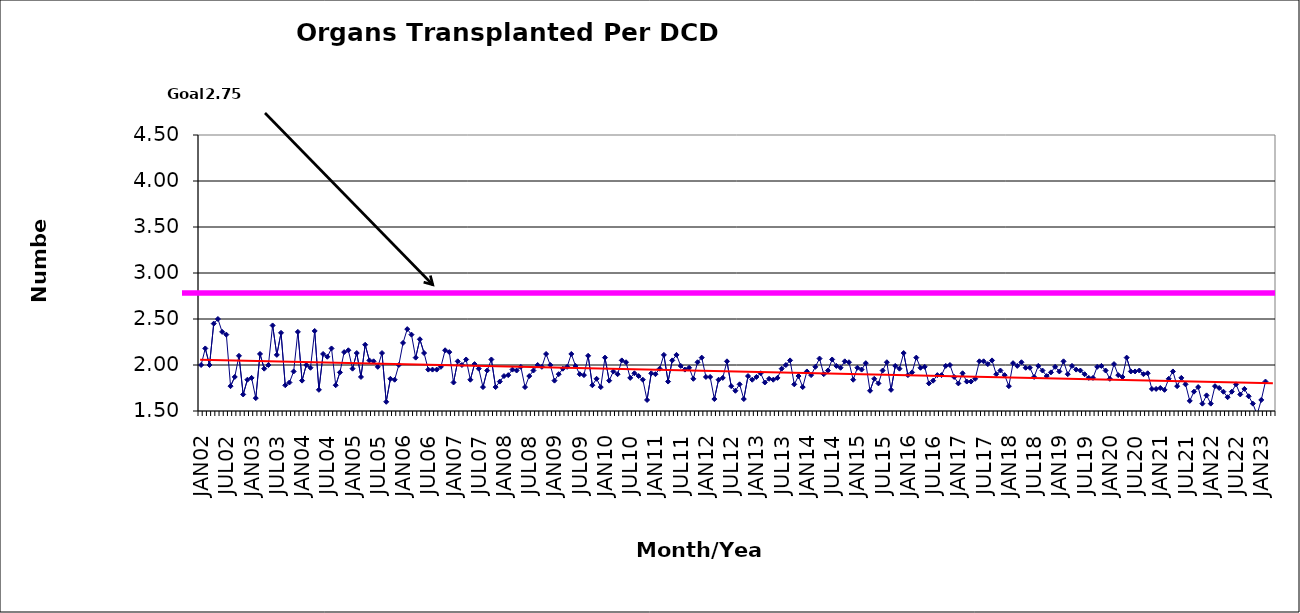
| Category | Series 0 |
|---|---|
| JAN02 | 2 |
| FEB02 | 2.18 |
| MAR02 | 2 |
| APR02 | 2.45 |
| MAY02 | 2.5 |
| JUN02 | 2.36 |
| JUL02 | 2.33 |
| AUG02 | 1.77 |
| SEP02 | 1.87 |
| OCT02 | 2.1 |
| NOV02 | 1.68 |
| DEC02 | 1.84 |
| JAN03 | 1.86 |
| FEB03 | 1.64 |
| MAR03 | 2.12 |
| APR03 | 1.96 |
| MAY03 | 2 |
| JUN03 | 2.43 |
| JUL03 | 2.11 |
| AUG03 | 2.35 |
| SEP03 | 1.78 |
| OCT03 | 1.81 |
| NOV03 | 1.93 |
| DEC03 | 2.36 |
| JAN04 | 1.83 |
| FEB04 | 2 |
| MAR04 | 1.97 |
| APR04 | 2.37 |
| MAY04 | 1.73 |
| JUN04 | 2.12 |
| JUL04 | 2.09 |
| AUG04 | 2.18 |
| SEP04 | 1.78 |
| OCT04 | 1.92 |
| NOV04 | 2.14 |
| DEC04 | 2.16 |
| JAN05 | 1.96 |
| FEB05 | 2.13 |
| MAR05 | 1.87 |
| APR05 | 2.22 |
| MAY05 | 2.05 |
| JUN05 | 2.04 |
| JUL05 | 1.98 |
| AUG05 | 2.13 |
| SEP05 | 1.6 |
| OCT05 | 1.85 |
| NOV05 | 1.84 |
| DEC05 | 2 |
| JAN06 | 2.24 |
| FEB06 | 2.39 |
| MAR06 | 2.33 |
| APR06 | 2.08 |
| MAY06 | 2.28 |
| JUN06 | 2.13 |
| JUL06 | 1.95 |
| AUG06 | 1.95 |
| SEP06 | 1.95 |
| OCT06 | 1.98 |
| NOV06 | 2.16 |
| DEC06 | 2.14 |
| JAN07 | 1.81 |
| FEB07 | 2.04 |
| MAR07 | 2 |
| APR07 | 2.06 |
| MAY07 | 1.84 |
| JUN07 | 2.01 |
| JUL07 | 1.96 |
| AUG07 | 1.76 |
| SEP07 | 1.94 |
| OCT07 | 2.06 |
| NOV07 | 1.76 |
| DEC07 | 1.82 |
| JAN08 | 1.88 |
| FEB08 | 1.89 |
| MAR08 | 1.95 |
| APR08 | 1.94 |
| MAY08 | 1.98 |
| JUN08 | 1.76 |
| JUL08 | 1.88 |
| AUG08 | 1.94 |
| SEP08 | 2 |
| OCT08 | 1.98 |
| NOV08 | 2.12 |
| DEC08 | 2 |
| JAN09 | 1.83 |
| FEB09 | 1.9 |
| MAR09 | 1.96 |
| APR09 | 1.98 |
| MAY09 | 2.12 |
| JUN09 | 1.99 |
| JUL09 | 1.9 |
| AUG09 | 1.89 |
| SEP09 | 2.1 |
| OCT09 | 1.78 |
| NOV09 | 1.85 |
| DEC09 | 1.76 |
| JAN10 | 2.08 |
| FEB10 | 1.83 |
| MAR10 | 1.93 |
| APR10 | 1.9 |
| MAY10 | 2.05 |
| JUN10 | 2.03 |
| JUL10 | 1.86 |
| AUG10 | 1.91 |
| SEP10 | 1.88 |
| OCT10 | 1.84 |
| NOV10 | 1.62 |
| DEC10 | 1.91 |
| JAN11 | 1.9 |
| FEB11 | 1.96 |
| MAR11 | 2.11 |
| APR11 | 1.82 |
| MAY11 | 2.05 |
| JUN11 | 2.11 |
| JUL11 | 1.99 |
| AUG11 | 1.95 |
| SEP11 | 1.97 |
| OCT11 | 1.85 |
| NOV11 | 2.03 |
| DEC11 | 2.08 |
| JAN12 | 1.87 |
| FEB12 | 1.87 |
| MAR12 | 1.63 |
| APR12 | 1.84 |
| MAY12 | 1.86 |
| JUN12 | 2.04 |
| JUL12 | 1.77 |
| AUG12 | 1.72 |
| SEP12 | 1.79 |
| OCT12 | 1.63 |
| NOV12 | 1.88 |
| DEC12 | 1.84 |
| JAN13 | 1.87 |
| FEB13 | 1.91 |
| MAR13 | 1.81 |
| APR13 | 1.85 |
| MAY13 | 1.84 |
| JUN13 | 1.86 |
| JUL13 | 1.96 |
| AUG13 | 2 |
| SEP13 | 2.05 |
| OCT13 | 1.79 |
| NOV13 | 1.88 |
| DEC13 | 1.76 |
| JAN14 | 1.93 |
| FEB14 | 1.89 |
| MAR14 | 1.98 |
| APR14 | 2.07 |
| MAY14 | 1.9 |
| JUN14 | 1.94 |
| JUL14 | 2.06 |
| AUG14 | 1.99 |
| SEP14 | 1.97 |
| OCT14 | 2.04 |
| NOV14 | 2.03 |
| DEC14 | 1.84 |
| JAN15 | 1.97 |
| FEB15 | 1.95 |
| MAR15 | 2.02 |
| APR15 | 1.72 |
| MAY15 | 1.85 |
| JUN15 | 1.8 |
| JUL15 | 1.94 |
| AUG15 | 2.03 |
| SEP15 | 1.73 |
| OCT15 | 1.99 |
| NOV15 | 1.96 |
| DEC15 | 2.13 |
| JAN16 | 1.89 |
| FEB16 | 1.92 |
| MAR16 | 2.08 |
| APR16 | 1.97 |
| MAY16 | 1.98 |
| JUN16 | 1.8 |
| JUL16 | 1.83 |
| AUG16 | 1.89 |
| SEP16 | 1.89 |
| OCT16 | 1.99 |
| NOV16 | 2 |
| DEC16 | 1.87 |
| JAN17 | 1.8 |
| FEB17 | 1.91 |
| MAR17 | 1.82 |
| APR17 | 1.82 |
| MAY17 | 1.85 |
| JUN17 | 2.04 |
| JUL17 | 2.04 |
| AUG17 | 2.01 |
| SEP17 | 2.05 |
| OCT17 | 1.9 |
| NOV17 | 1.94 |
| DEC17 | 1.89 |
| JAN18 | 1.77 |
| FEB18 | 2.02 |
| MAR18 | 1.99 |
| APR18 | 2.03 |
| MAY18 | 1.97 |
| JUN18 | 1.97 |
| JUL18 | 1.87 |
| AUG18 | 1.99 |
| SEP18 | 1.94 |
| OCT18 | 1.88 |
| NOV18 | 1.92 |
| DEC18 | 1.98 |
| JAN19 | 1.93 |
| FEB19 | 2.04 |
| MAR19 | 1.9 |
| APR19 | 1.99 |
| MAY19 | 1.95 |
| JUN19 | 1.94 |
| JUL19 | 1.9 |
| AUG19 | 1.86 |
| SEP19 | 1.86 |
| OCT19 | 1.98 |
| NOV19 | 1.99 |
| DEC19 | 1.94 |
| JAN20 | 1.85 |
| FEB20 | 2.01 |
| MAR20 | 1.89 |
| APR20 | 1.87 |
| MAY20 | 2.08 |
| JUN20 | 1.93 |
| JUL20 | 1.93 |
| AUG20 | 1.94 |
| SEP20 | 1.9 |
| OCT20 | 1.91 |
| NOV20 | 1.74 |
| DEC20 | 1.74 |
| JAN21 | 1.75 |
| FEB21 | 1.73 |
| MAR21 | 1.85 |
| APR21 | 1.93 |
| MAY21 | 1.77 |
| JUN21 | 1.86 |
| JUL21 | 1.79 |
| AUG21 | 1.61 |
| SEP21 | 1.71 |
| OCT21 | 1.76 |
| NOV21 | 1.58 |
| DEC21 | 1.67 |
| JAN22 | 1.58 |
| FEB22 | 1.77 |
| MAR22 | 1.75 |
| APR22 | 1.71 |
| MAY22 | 1.65 |
| JUN22 | 1.71 |
| JUL22 | 1.79 |
| AUG22 | 1.68 |
| SEP22 | 1.74 |
| OCT22 | 1.66 |
| NOV22 | 1.58 |
| DEC22 | 1.46 |
| JAN23 | 1.62 |
| FEB23 | 1.82 |